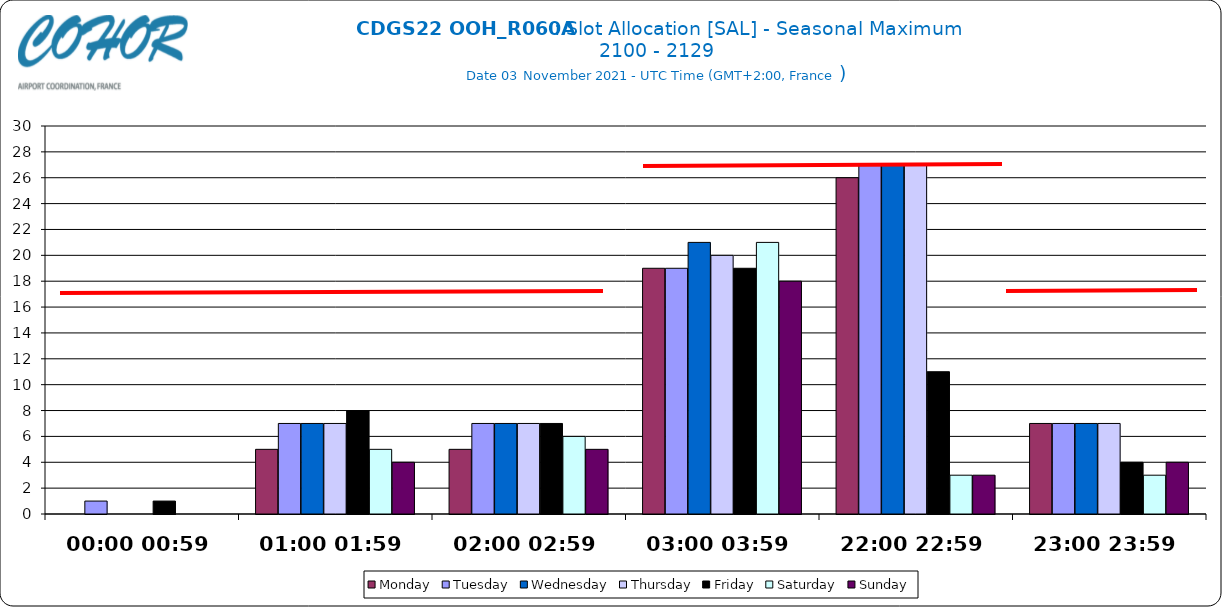
| Category | Monday | Tuesday | Wednesday | Thursday | Friday | Saturday | Sunday |
|---|---|---|---|---|---|---|---|
| 00:00 00:59 | 0 | 1 | 0 | 0 | 1 | 0 | 0 |
| 01:00 01:59 | 5 | 7 | 7 | 7 | 8 | 5 | 4 |
| 02:00 02:59 | 5 | 7 | 7 | 7 | 7 | 6 | 5 |
| 03:00 03:59 | 19 | 19 | 21 | 20 | 19 | 21 | 18 |
| 22:00 22:59 | 26 | 27 | 27 | 27 | 11 | 3 | 3 |
| 23:00 23:59 | 7 | 7 | 7 | 7 | 4 | 3 | 4 |